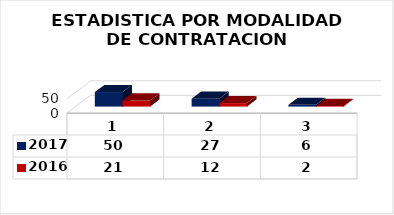
| Category | 2017 | 2016 |
|---|---|---|
| 0 | 50 |  |
| 1 | 27 |  |
| 2 | 6 |  |